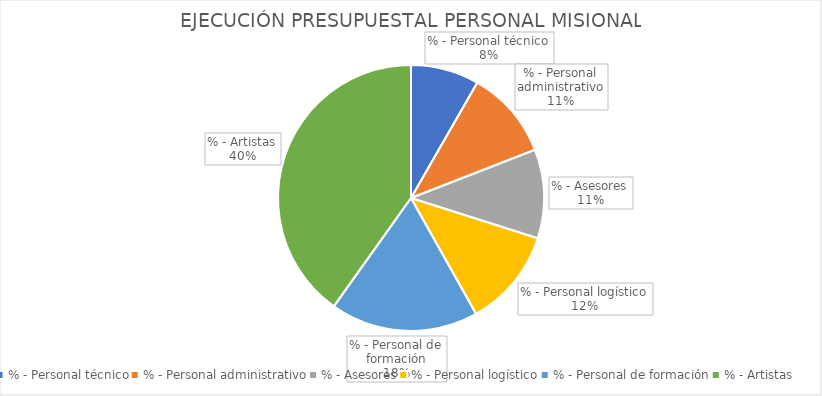
| Category | % |
|---|---|
| % - Personal técnico | 0.045 |
| % - Personal administrativo | 0.059 |
| % - Asesores | 0.059 |
| % - Personal logístico | 0.066 |
| % - Personal de formación | 0.099 |
| % - Artistas | 0.22 |